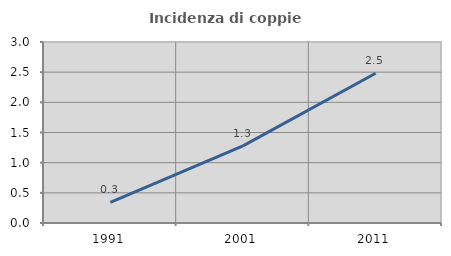
| Category | Incidenza di coppie miste |
|---|---|
| 1991.0 | 0.343 |
| 2001.0 | 1.278 |
| 2011.0 | 2.482 |